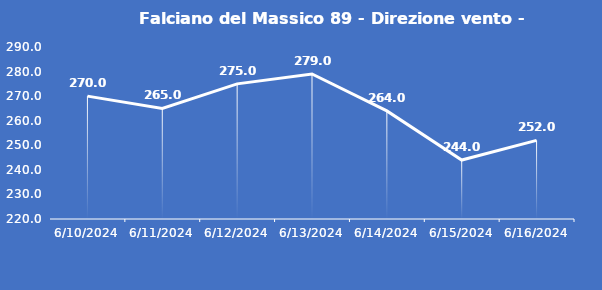
| Category | Falciano del Massico 89 - Direzione vento - Grezzo (°N) |
|---|---|
| 6/10/24 | 270 |
| 6/11/24 | 265 |
| 6/12/24 | 275 |
| 6/13/24 | 279 |
| 6/14/24 | 264 |
| 6/15/24 | 244 |
| 6/16/24 | 252 |